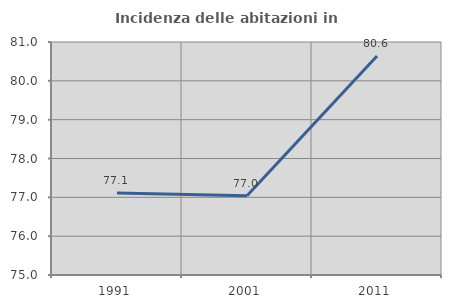
| Category | Incidenza delle abitazioni in proprietà  |
|---|---|
| 1991.0 | 77.114 |
| 2001.0 | 77.039 |
| 2011.0 | 80.638 |